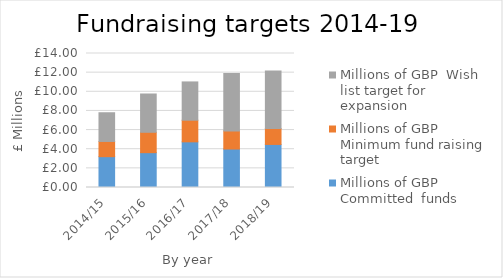
| Category | Millions of GBP  Committed  funds | Millions of GBP  Minimum fund raising target  | Millions of GBP  Wish list target for expansion |
|---|---|---|---|
| 2014/15 | 3.22 | 1.59 | 3 |
| 2015/16 | 3.64 | 2.13 | 4 |
| 2016/17 | 4.77 | 2.26 | 4 |
| 2017/18 | 4.02 | 1.89 | 6 |
| 2018/19 | 4.5 | 1.67 | 6 |